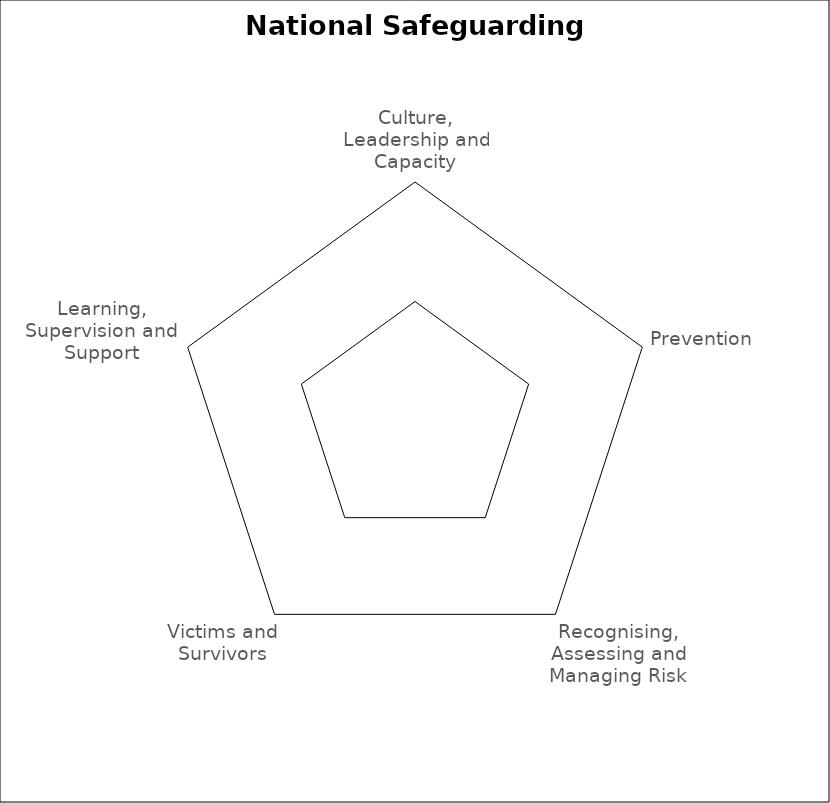
| Category | Series 0 |
|---|---|
| Culture, Leadership and Capacity | 0 |
| Prevention | 0 |
| Recognising, Assessing and Managing Risk | 0 |
| Victims and Survivors | 0 |
| Learning, Supervision and Support | 0 |